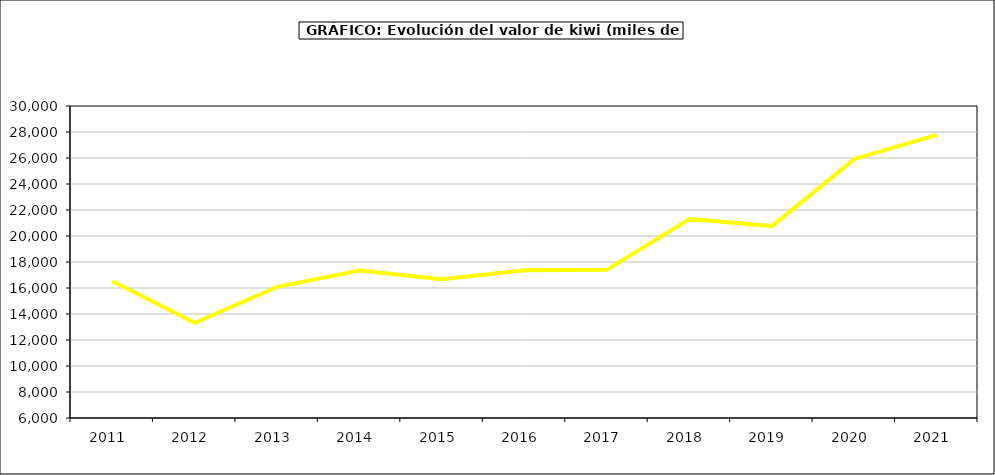
| Category | valor kiwi |
|---|---|
| 2011.0 | 16538.05 |
| 2012.0 | 13318.873 |
| 2013.0 | 16091.324 |
| 2014.0 | 17344.225 |
| 2015.0 | 16673 |
| 2016.0 | 17366 |
| 2017.0 | 17410.786 |
| 2018.0 | 21304.319 |
| 2019.0 | 20763.178 |
| 2020.0 | 25913.973 |
| 2021.0 | 27777.188 |